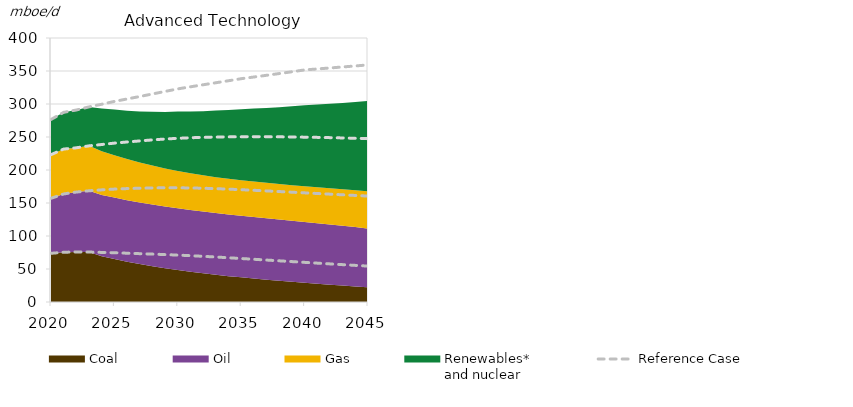
| Category | Reference Case | Ref Oil | Ref Gas | Ref Ren |
|---|---|---|---|---|
| 0 | 73.761 | 83.308 | 66.174 | 53.297 |
| 1 | 75.357 | 88.371 | 67.995 | 55.647 |
| 2 | 75.925 | 90.651 | 67.064 | 57.255 |
| 3 | 75.705 | 92.783 | 68.093 | 59.058 |
| 4 | 75.121 | 94.792 | 68.713 | 61.007 |
| 5 | 74.623 | 96.447 | 69.649 | 63.184 |
| 6 | 73.948 | 97.893 | 70.626 | 65.159 |
| 7 | 73.243 | 99.156 | 71.671 | 67.294 |
| 8 | 72.564 | 100.281 | 72.761 | 69.601 |
| 9 | 71.846 | 101.221 | 73.864 | 72.118 |
| 10 | 71.057 | 101.983 | 74.972 | 74.881 |
| 11 | 70.175 | 102.618 | 76.072 | 77.19 |
| 12 | 69.203 | 103.148 | 77.153 | 79.642 |
| 13 | 68.154 | 103.588 | 78.208 | 82.248 |
| 14 | 67.037 | 103.954 | 79.231 | 85.021 |
| 15 | 65.891 | 104.255 | 80.219 | 87.976 |
| 16 | 64.73 | 104.524 | 81.168 | 90.475 |
| 17 | 63.558 | 104.76 | 82.069 | 93.108 |
| 18 | 62.386 | 104.964 | 82.898 | 95.883 |
| 19 | 61.216 | 105.145 | 83.672 | 98.812 |
| 20 | 60.048 | 105.33 | 84.388 | 101.861 |
| 21 | 58.882 | 105.504 | 85.042 | 103.681 |
| 22 | 57.737 | 105.661 | 85.634 | 105.574 |
| 23 | 56.605 | 105.806 | 86.162 | 107.544 |
| 24 | 55.489 | 105.942 | 86.626 | 109.596 |
| 25 | 54.388 | 106.07 | 87.029 | 111.734 |